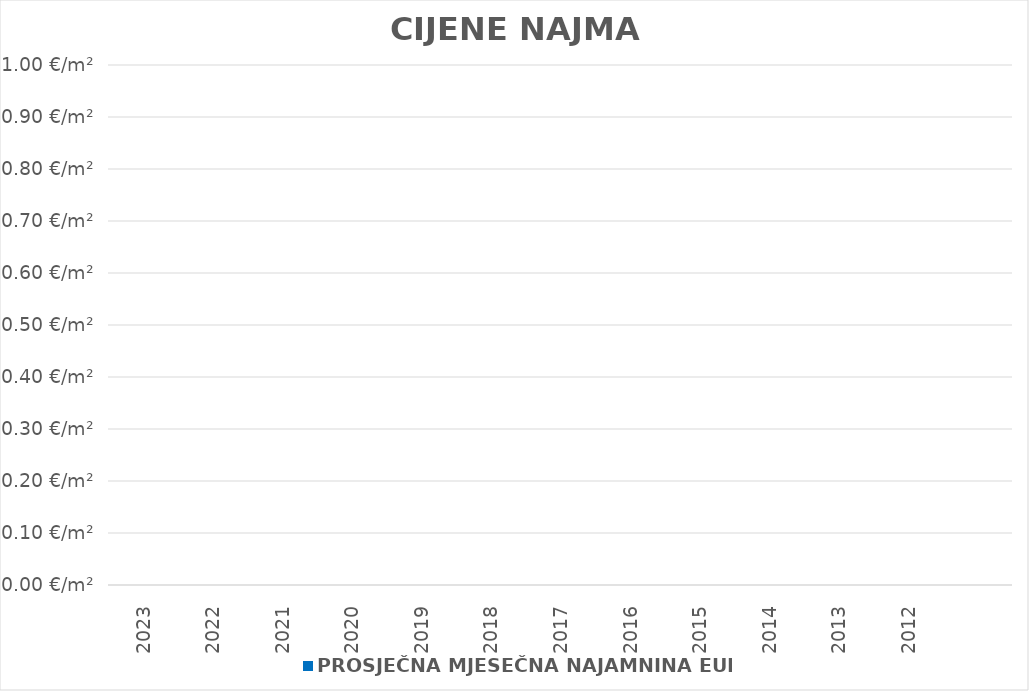
| Category | PROSJEČNA MJESEČNA NAJAMNINA EUR/m² |
|---|---|
| 2023 | 0 |
| 2022 | 0 |
| 2021 | 0 |
| 2020 | 0 |
| 2019 | 0 |
| 2018 | 0 |
| 2017 | 0 |
| 2016 | 0 |
| 2015 | 0 |
| 2014 | 0 |
| 2013 | 0 |
| 2012 | 0 |